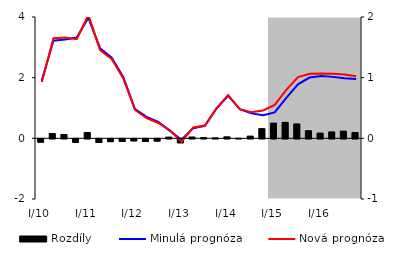
| Category | Rozdíly |
|---|---|
| I/10 | -0.055 |
| II | 0.079 |
| III | 0.064 |
| IV | -0.057 |
| I/11 | 0.097 |
| II | -0.06 |
| III | -0.046 |
| IV | -0.043 |
| I/12 | -0.033 |
| II | -0.043 |
| III | -0.037 |
| IV | 0.02 |
| I/13 | -0.065 |
| II | 0.022 |
| III | 0.013 |
| IV | 0.008 |
| I/14 | 0.025 |
| II | 0.001 |
| III | 0.037 |
| IV | 0.16 |
| I/15 | 0.251 |
| II | 0.263 |
| III | 0.237 |
| IV | 0.125 |
| I/16 | 0.087 |
| II | 0.106 |
| III | 0.119 |
| IV | 0.096 |